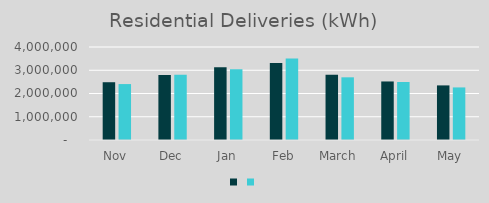
| Category | Series 1 | Series 0 |
|---|---|---|
| Nov | 2484917 | 2405818 |
| Dec | 2793607 | 2803771 |
| Jan | 3124442 | 3040217 |
| Feb | 3307618 | 3510451 |
| March | 2805250 | 2696163 |
| April | 2517652 | 2493703 |
| May | 2348338 | 2261286 |